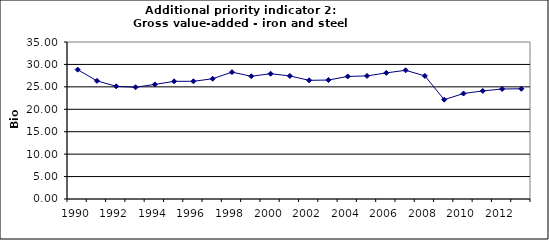
| Category | Gross value-added - iron and steel industry, Bio Euro (EC95) |
|---|---|
| 1990 | 28.838 |
| 1991 | 26.332 |
| 1992 | 25.128 |
| 1993 | 24.911 |
| 1994 | 25.537 |
| 1995 | 26.236 |
| 1996 | 26.236 |
| 1997 | 26.814 |
| 1998 | 28.284 |
| 1999 | 27.368 |
| 2000 | 27.922 |
| 2001 | 27.44 |
| 2002 | 26.453 |
| 2003 | 26.525 |
| 2004 | 27.32 |
| 2005 | 27.44 |
| 2006 | 28.115 |
| 2007 | 28.693 |
| 2008 | 27.44 |
| 2009 | 22.14 |
| 2010 | 23.513 |
| 2011 | 24.092 |
| 2012 | 24.525 |
| 2013 | 24.573 |